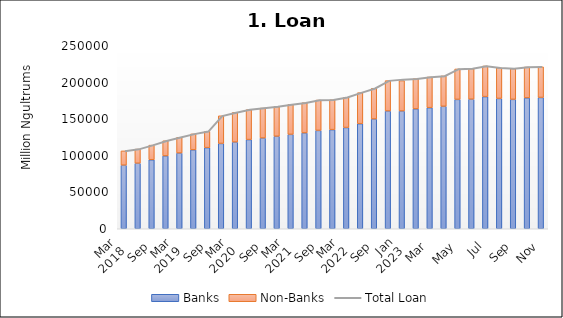
| Category | Banks | Non-Banks |
|---|---|---|
| 0 | 86839.062 | 19536.13 |
| 1 | 89492.789 | 19317.924 |
| 2 | 94257.106 | 19993.763 |
| 3 | 99542.627 | 20696.164 |
| 4 | 103455.022 | 21541.616 |
| 5 | 107823.786 | 21766.128 |
| 6 | 110793.514 | 22289.762 |
| 7 | 116541.685 | 37784.488 |
| 8 | 118433.441 | 40493.857 |
| 9 | 121831.338 | 40869.086 |
| 10 | 123947.936 | 40898.135 |
| 11 | 126363.799 | 40625.692 |
| 12 | 128951.639 | 40851.287 |
| 13 | 130897.833 | 41243.55 |
| 14 | 134359.87 | 41428.68 |
| 15 | 135415.887 | 40793.4 |
| 16 | 138284.661 | 41288.566 |
| 17 | 143532.338 | 42375.24 |
| 18 | 149966.968 | 41992.436 |
| 19 | 160873.72 | 41509.575 |
| 20 | 160873.72 | 41509.575 |
| 21 | 163784.222 | 41233.942 |
| 22 | 165428.061 | 41861.82 |
| 23 | 167303.912 | 41496.685 |
| 24 | 176700.108 | 41607.518 |
| 25 | 176977.708 | 41819.738 |
| 26 | 180513.181 | 41855.293 |
| 27 | 178011.08 | 41903.059 |
| 28 | 176771.277 | 42122.595 |
| 29 | 178802.345 | 42166.639 |
| 30 | 179344.973 | 41882.676 |